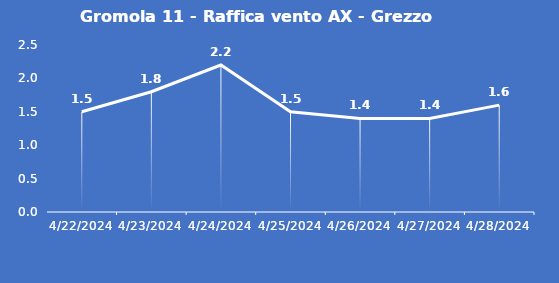
| Category | Gromola 11 - Raffica vento AX - Grezzo (m/s) |
|---|---|
| 4/22/24 | 1.5 |
| 4/23/24 | 1.8 |
| 4/24/24 | 2.2 |
| 4/25/24 | 1.5 |
| 4/26/24 | 1.4 |
| 4/27/24 | 1.4 |
| 4/28/24 | 1.6 |